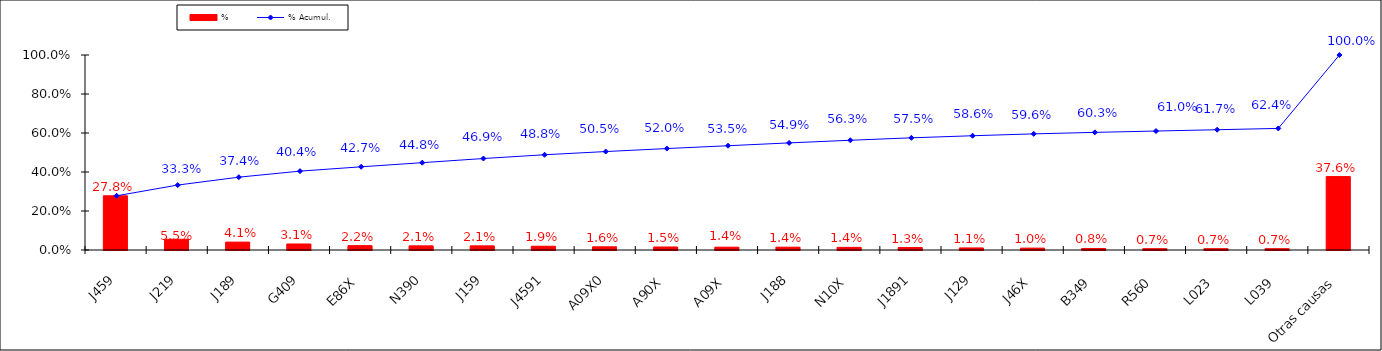
| Category | % |
|---|---|
| J459 | 0.278 |
| J219 | 0.055 |
| J189 | 0.041 |
| G409 | 0.031 |
| E86X | 0.022 |
| N390 | 0.021 |
| J159 | 0.021 |
| J4591 | 0.019 |
| A09X0 | 0.016 |
| A90X | 0.015 |
| A09X | 0.014 |
| J188 | 0.014 |
| N10X | 0.014 |
| J1891 | 0.013 |
| J129 | 0.011 |
| J46X | 0.01 |
| B349 | 0.008 |
| R560 | 0.007 |
| L023 | 0.007 |
| L039 | 0.007 |
| Otras causas | 0.376 |